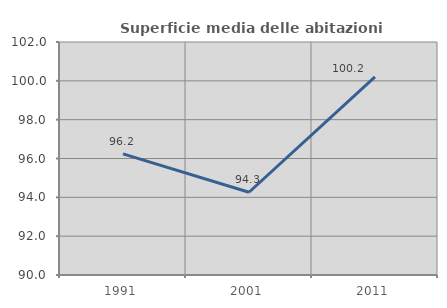
| Category | Superficie media delle abitazioni occupate |
|---|---|
| 1991.0 | 96.235 |
| 2001.0 | 94.262 |
| 2011.0 | 100.202 |